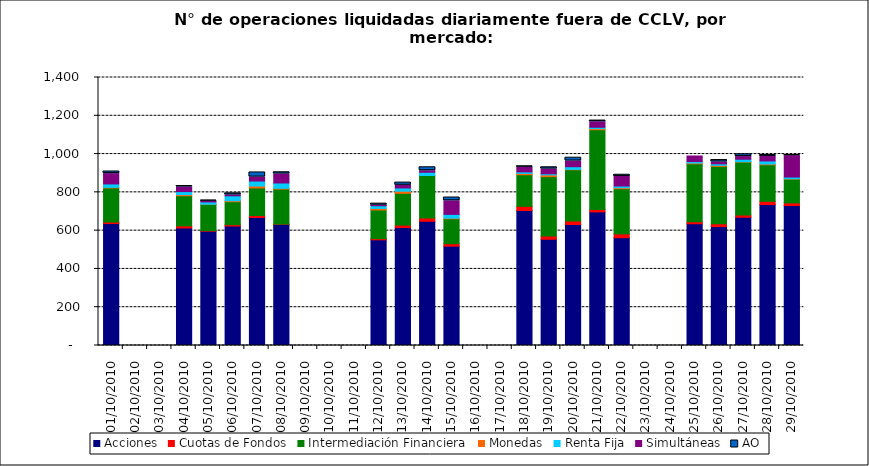
| Category | Acciones | Cuotas de Fondos | Intermediación Financiera | Monedas | Renta Fija | Simultáneas | AO |
|---|---|---|---|---|---|---|---|
| 01/10/2010 | 637 | 8 | 178 | 3 | 18 | 54 | 11 |
| 04/10/2010 | 614 | 11 | 157 | 6 | 16 | 24 | 5 |
| 05/10/2010 | 597 | 3 | 137 | 1 | 12 | 4 | 3 |
| 06/10/2010 | 624 | 7 | 120 | 5 | 26 | 5 | 8 |
| 07/10/2010 | 669 | 10 | 144 | 10 | 26 | 21 | 24 |
| 08/10/2010 | 632 | 2 | 183 | 4 | 28 | 47 | 9 |
| 12/10/2010 | 552 | 6 | 150 | 8 | 14 | 3 | 8 |
| 13/10/2010 | 616 | 13 | 166 | 11 | 17 | 14 | 14 |
| 14/10/2010 | 649 | 17 | 222 | 0 | 17 | 8 | 18 |
| 15/10/2010 | 519 | 13 | 130 | 3 | 20 | 71 | 17 |
| 18/10/2010 | 705 | 22 | 165 | 7 | 8 | 24 | 5 |
| 19/10/2010 | 555 | 17 | 310 | 9 | 6 | 25 | 9 |
| 20/10/2010 | 632 | 19 | 267 | 2 | 14 | 30 | 17 |
| 21/10/2010 | 698 | 13 | 416 | 6 | 7 | 29 | 6 |
| 22/10/2010 | 563 | 20 | 236 | 5 | 9 | 50 | 9 |
| 25/10/2010 | 636 | 10 | 303 | 4 | 8 | 29 | 0 |
| 26/10/2010 | 621 | 15 | 300 | 5 | 8 | 10 | 10 |
| 27/10/2010 | 670 | 12 | 276 | 2 | 13 | 14 | 12 |
| 28/10/2010 | 736 | 17 | 191 | 4 | 16 | 24 | 7 |
| 29/10/2010 | 731 | 14 | 124 | 2 | 9 | 112 | 2 |